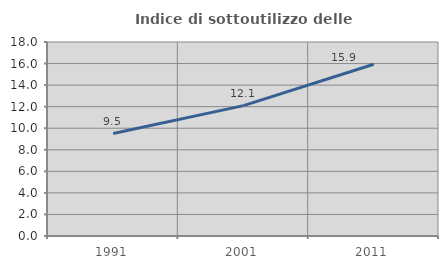
| Category | Indice di sottoutilizzo delle abitazioni  |
|---|---|
| 1991.0 | 9.503 |
| 2001.0 | 12.098 |
| 2011.0 | 15.94 |